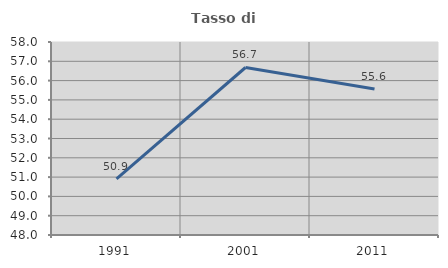
| Category | Tasso di occupazione   |
|---|---|
| 1991.0 | 50.909 |
| 2001.0 | 56.679 |
| 2011.0 | 55.569 |